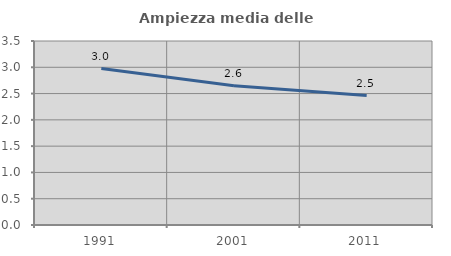
| Category | Ampiezza media delle famiglie |
|---|---|
| 1991.0 | 2.976 |
| 2001.0 | 2.649 |
| 2011.0 | 2.461 |